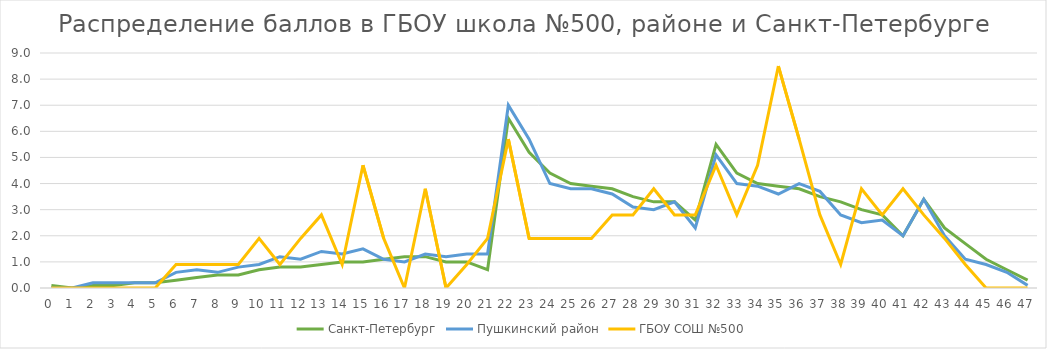
| Category | Санкт-Петербург | Пушкинский район | ГБОУ СОШ №500 |
|---|---|---|---|
| 0.0 | 0.1 | 0 | 0 |
| 1.0 | 0 | 0 | 0 |
| 2.0 | 0.1 | 0.2 | 0 |
| 3.0 | 0.1 | 0.2 | 0 |
| 4.0 | 0.2 | 0.2 | 0 |
| 5.0 | 0.2 | 0.2 | 0 |
| 6.0 | 0.3 | 0.6 | 0.9 |
| 7.0 | 0.4 | 0.7 | 0.9 |
| 8.0 | 0.5 | 0.6 | 0.9 |
| 9.0 | 0.5 | 0.8 | 0.9 |
| 10.0 | 0.7 | 0.9 | 1.9 |
| 11.0 | 0.8 | 1.2 | 0.9 |
| 12.0 | 0.8 | 1.1 | 1.9 |
| 13.0 | 0.9 | 1.4 | 2.8 |
| 14.0 | 1 | 1.3 | 0.9 |
| 15.0 | 1 | 1.5 | 4.7 |
| 16.0 | 1.1 | 1.1 | 1.9 |
| 17.0 | 1.2 | 1 | 0 |
| 18.0 | 1.2 | 1.3 | 3.8 |
| 19.0 | 1 | 1.2 | 0 |
| 20.0 | 1 | 1.3 | 0.9 |
| 21.0 | 0.7 | 1.3 | 1.9 |
| 22.0 | 6.5 | 7 | 5.7 |
| 23.0 | 5.2 | 5.7 | 1.9 |
| 24.0 | 4.4 | 4 | 1.9 |
| 25.0 | 4 | 3.8 | 1.9 |
| 26.0 | 3.9 | 3.8 | 1.9 |
| 27.0 | 3.8 | 3.6 | 2.8 |
| 28.0 | 3.5 | 3.1 | 2.8 |
| 29.0 | 3.3 | 3 | 3.8 |
| 30.0 | 3.3 | 3.3 | 2.8 |
| 31.0 | 2.6 | 2.3 | 2.8 |
| 32.0 | 5.5 | 5.1 | 4.7 |
| 33.0 | 4.4 | 4 | 2.8 |
| 34.0 | 4 | 3.9 | 4.7 |
| 35.0 | 3.9 | 3.6 | 8.5 |
| 36.0 | 3.8 | 4 | 5.7 |
| 37.0 | 3.5 | 3.7 | 2.8 |
| 38.0 | 3.3 | 2.8 | 0.9 |
| 39.0 | 3 | 2.5 | 3.8 |
| 40.0 | 2.8 | 2.6 | 2.8 |
| 41.0 | 2 | 2 | 3.8 |
| 42.0 | 3.4 | 3.4 | 2.8 |
| 43.0 | 2.3 | 2 | 1.9 |
| 44.0 | 1.7 | 1.1 | 0.9 |
| 45.0 | 1.1 | 0.9 | 0 |
| 46.0 | 0.7 | 0.6 | 0 |
| 47.0 | 0.3 | 0.1 | 0 |